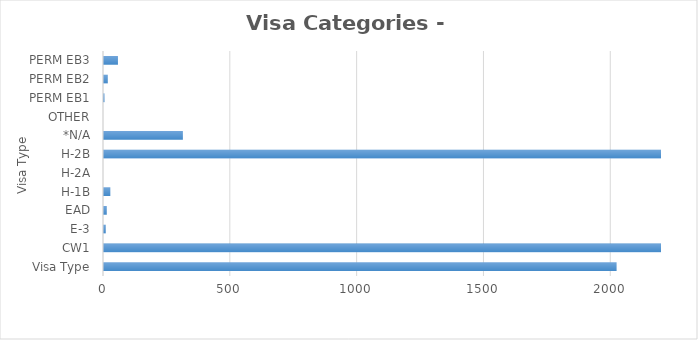
| Category | Series 0 |
|---|---|
| Visa Type | 2021 |
| CW1 | 11805 |
| E-3 | 7 |
| EAD | 11 |
| H-1B | 25 |
| H-2A | 0 |
| H-2B | 3786 |
| *N/A | 311 |
| OTHER | 0 |
| PERM EB1 | 2 |
| PERM EB2 | 15 |
| PERM EB3 | 55 |